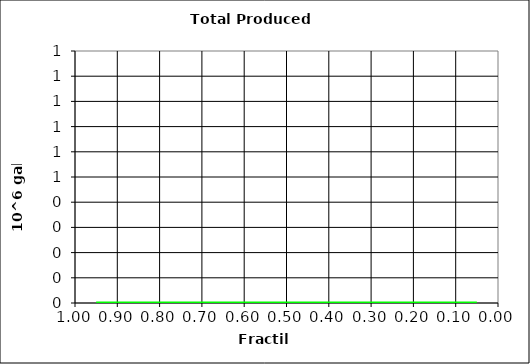
| Category | Series 2 |
|---|---|
| 0.05 | 0 |
| 0.1 | 0 |
| 0.15000000000000002 | 0 |
| 0.2 | 0 |
| 0.25 | 0 |
| 0.3 | 0 |
| 0.35 | 0 |
| 0.39999999999999997 | 0 |
| 0.44999999999999996 | 0 |
| 0.49999999999999994 | 0 |
| 0.5499999999999999 | 0 |
| 0.6 | 0 |
| 0.65 | 0 |
| 0.7000000000000001 | 0 |
| 0.7500000000000001 | 0 |
| 0.8000000000000002 | 0 |
| 0.8500000000000002 | 0 |
| 0.9000000000000002 | 0 |
| 0.9500000000000003 | 0 |